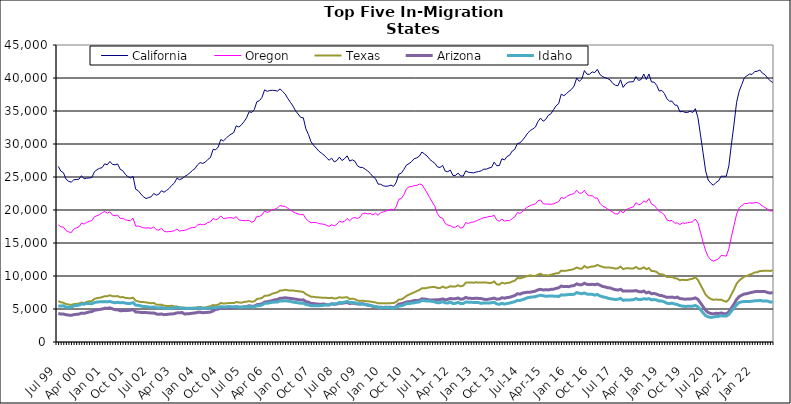
| Category | California | Oregon | Texas | Arizona | Idaho |
|---|---|---|---|---|---|
| Jul 99 | 26605 | 17749 | 6209 | 4339 | 5471 |
| Aug 99 | 25882 | 17447 | 6022 | 4228 | 5444 |
| Sep 99 | 25644 | 17401 | 5941 | 4237 | 5488 |
| Oct 99 | 24669 | 16875 | 5751 | 4134 | 5279 |
| Nov 99 | 24353 | 16701 | 5680 | 4073 | 5260 |
| Dec 99 | 24218 | 16570 | 5619 | 4042 | 5269 |
| Jan 00 | 24574 | 17109 | 5736 | 4142 | 5485 |
| Feb 00 | 24620 | 17295 | 5789 | 4192 | 5530 |
| Mar 00 | 24655 | 17436 | 5826 | 4226 | 5590 |
| Apr 00 | 25195 | 18009 | 5980 | 4375 | 5748 |
| May 00 | 24730 | 17875 | 5897 | 4337 | 5729 |
| Jun 00 | 24825 | 18113 | 6070 | 4444 | 5853 |
| Jul 00 | 24857 | 18294 | 6163 | 4555 | 5824 |
| Aug 00 | 24913 | 18376 | 6199 | 4603 | 5788 |
| Sep 00 | 25792 | 18971 | 6529 | 4804 | 5976 |
| Oct 00 | 26106 | 19135 | 6643 | 4870 | 6058 |
| Nov 00 | 26315 | 19306 | 6705 | 4926 | 6085 |
| Dec 00 | 26415 | 19570 | 6793 | 4991 | 6096 |
| Jan 01 | 26995 | 19781 | 6942 | 5122 | 6119 |
| Feb 01 | 26851 | 19519 | 6948 | 5089 | 6090 |
| Mar 01 | 27352 | 19720 | 7080 | 5180 | 6143 |
| Apr 01 | 26918 | 19221 | 6943 | 5020 | 6020 |
| May 01 | 26848 | 19126 | 6924 | 4899 | 5950 |
| Jun 01 | 26974 | 19241 | 6959 | 4895 | 6019 |
| Jul 01 | 26172 | 18725 | 6778 | 4737 | 5951 |
| Aug 01 | 25943 | 18736 | 6810 | 4757 | 5973 |
| Sep 01 | 25399 | 18514 | 6688 | 4753 | 5895 |
| Oct 01 | 25050 | 18415 | 6650 | 4780 | 5833 |
| Nov 01 | 24873 | 18381 | 6631 | 4826 | 5850 |
| Dec 01 | 25099 | 18765 | 6708 | 4898 | 5969 |
| Jan 02 | 23158 | 17561 | 6261 | 4560 | 5595 |
| Feb 02 | 22926 | 17573 | 6162 | 4531 | 5560 |
| Mar 02 | 22433 | 17452 | 6052 | 4481 | 5458 |
| Apr 02 | 22012 | 17314 | 6046 | 4458 | 5380 |
| May 02 | 21733 | 17267 | 6007 | 4452 | 5358 |
| Jun 02 | 21876 | 17298 | 5933 | 4444 | 5315 |
| Jul 02 | 21997 | 17209 | 5873 | 4383 | 5243 |
| Aug 02 | 22507 | 17436 | 5929 | 4407 | 5315 |
| Sep 02 | 22244 | 17010 | 5672 | 4248 | 5192 |
| Oct 02 | 22406 | 16952 | 5625 | 4191 | 5167 |
| Nov 02 | 22922 | 17223 | 5663 | 4242 | 5221 |
| Dec 02 | 22693 | 16770 | 5499 | 4142 | 5120 |
| Jan 03 | 22964 | 16694 | 5463 | 4166 | 5089 |
| Feb 03 | 23276 | 16727 | 5461 | 4226 | 5077 |
| Mar 03 | 23736 | 16766 | 5486 | 4251 | 5145 |
| Apr 03 | 24079 | 16859 | 5389 | 4289 | 5145 |
| May 03 | 24821 | 17117 | 5378 | 4415 | 5254 |
| Jun 03 | 24592 | 16812 | 5273 | 4426 | 5135 |
| Jul 03 | 24754 | 16875 | 5226 | 4466 | 5124 |
| Aug 03 | 25092 | 16922 | 5181 | 4244 | 5100 |
| Sep 03 | 25316 | 17036 | 5181 | 4279 | 5086 |
| Oct 03 | 25622 | 17228 | 5139 | 4301 | 5110 |
| Nov 03 | 25984 | 17335 | 5175 | 4362 | 5091 |
| Dec 03 | 26269 | 17350 | 5189 | 4396 | 5113 |
| Jan 04 | 26852 | 17734 | 5255 | 4492 | 5152 |
| Feb 04 | 27184 | 17860 | 5301 | 4502 | 5183 |
| Mar 04 | 27062 | 17757 | 5227 | 4443 | 5056 |
| Apr 04 | 27238 | 17840 | 5227 | 4461 | 5104 |
| May 04 | 27671 | 18113 | 5345 | 4493 | 5095 |
| Jun 04 | 27949 | 18201 | 5416 | 4532 | 5103 |
| Jul 04 | 29172 | 18727 | 5597 | 4697 | 5231 |
| Aug 04 | 29122 | 18529 | 5561 | 4945 | 5197 |
| Sep 04 | 29542 | 18678 | 5656 | 4976 | 5237 |
| Oct 04 | 30674 | 19108 | 5922 | 5188 | 5363 |
| Nov 04 | 30472 | 18716 | 5823 | 5106 | 5321 |
| Dec 04 | 30831 | 18755 | 5838 | 5135 | 5312 |
| Jan 05 | 31224 | 18823 | 5906 | 5155 | 5374 |
| Feb 05 | 31495 | 18842 | 5898 | 5168 | 5357 |
| Mar 05 | 31714 | 18738 | 5894 | 5212 | 5313 |
| Apr 05 | 32750 | 18998 | 6060 | 5340 | 5350 |
| May 05 | 32575 | 18504 | 5989 | 5269 | 5276 |
| Jun 05 | 32898 | 18414 | 5954 | 5252 | 5271 |
| Jul 05 | 33384 | 18395 | 6062 | 5322 | 5322 |
| Aug 05 | 33964 | 18381 | 6113 | 5375 | 5316 |
| Sep 05 | 34897 | 18426 | 6206 | 5493 | 5362 |
| Oct 05 | 34780 | 18132 | 6100 | 5408 | 5308 |
| Nov 05 | 35223 | 18332 | 6162 | 5434 | 5314 |
| Dec 05 | 36415 | 19047 | 6508 | 5658 | 5487 |
| Jan 06 | 36567 | 19032 | 6576 | 5688 | 5480 |
| Feb 06 | 37074 | 19257 | 6692 | 5792 | 5616 |
| Mar 06 | 38207 | 19845 | 6993 | 6052 | 5850 |
| Apr 06 | 37976 | 19637 | 7024 | 6101 | 5864 |
| May 06 | 38099 | 19781 | 7114 | 6178 | 5943 |
| Jun 06 | 38141 | 20061 | 7331 | 6276 | 6018 |
| Jul 06 | 38097 | 20111 | 7431 | 6399 | 6046 |
| Aug 06 | 38021 | 20333 | 7542 | 6450 | 6064 |
| Sep 06 | 38349 | 20686 | 7798 | 6627 | 6232 |
| Oct 06 | 37947 | 20591 | 7825 | 6647 | 6216 |
| Nov 06 | 37565 | 20526 | 7907 | 6707 | 6244 |
| Dec 06 | 36884 | 20272 | 7840 | 6648 | 6192 |
| Jan 07 | 36321 | 19984 | 7789 | 6597 | 6151 |
| Feb 07 | 35752 | 19752 | 7799 | 6554 | 6048 |
| Mar 07 | 35025 | 19547 | 7737 | 6487 | 5989 |
| Apr 07 | 34534 | 19412 | 7685 | 6430 | 5937 |
| May 07 | 34022 | 19296 | 7654 | 6353 | 5858 |
| Jun 07 | 33974 | 19318 | 7577 | 6390 | 5886 |
| Jul 07 | 32298 | 18677 | 7250 | 6117 | 5682 |
| Aug 07 | 31436 | 18322 | 7070 | 6034 | 5617 |
| Sep 07 | 30331 | 18087 | 6853 | 5847 | 5500 |
| Oct 07 | 29813 | 18108 | 6839 | 5821 | 5489 |
| Nov 07 | 29384 | 18105 | 6777 | 5769 | 5481 |
| Dec 07 | 28923 | 17949 | 6760 | 5733 | 5499 |
| Jan 08 | 28627 | 17890 | 6721 | 5732 | 5521 |
| Feb 08 | 28328 | 17834 | 6719 | 5749 | 5579 |
| Mar 08 | 27911 | 17680 | 6690 | 5650 | 5614 |
| Apr 08 | 27543 | 17512 | 6656 | 5612 | 5635 |
| May 08 | 27856 | 17754 | 6705 | 5774 | 5798 |
| Jun 08 | 27287 | 17589 | 6593 | 5717 | 5745 |
| Jul 08 | 27495 | 17834 | 6623 | 5761 | 5807 |
| Aug 08 | 28018 | 18309 | 6789 | 5867 | 5982 |
| Sep-08 | 27491 | 18164 | 6708 | 5864 | 5954 |
| Oct 08 | 27771 | 18291 | 6755 | 5942 | 6032 |
| Nov 08 | 28206 | 18706 | 6787 | 5970 | 6150 |
| Dec 08 | 27408 | 18353 | 6505 | 5832 | 5975 |
| Jan 09 | 27601 | 18778 | 6569 | 5890 | 5995 |
| Feb 09 | 27394 | 18863 | 6483 | 5845 | 5936 |
| Mar 09 | 26690 | 18694 | 6273 | 5751 | 5806 |
| Apr 09 | 26461 | 18943 | 6222 | 5735 | 5777 |
| May 09 | 26435 | 19470 | 6272 | 5819 | 5767 |
| Jun 09 | 26187 | 19522 | 6199 | 5700 | 5649 |
| Jul 09 | 25906 | 19408 | 6171 | 5603 | 5617 |
| Aug 09 | 25525 | 19469 | 6128 | 5533 | 5540 |
| Sep 09 | 25050 | 19249 | 6059 | 5405 | 5437 |
| Oct 09 | 24741 | 19529 | 6004 | 5349 | 5369 |
| Nov 09 | 23928 | 19187 | 5854 | 5271 | 5248 |
| Dec 09 | 23899 | 19607 | 5886 | 5261 | 5195 |
| Jan 10 | 23676 | 19703 | 5881 | 5232 | 5234 |
| Feb 10 | 23592 | 19845 | 5850 | 5272 | 5236 |
| Mar 10 | 23634 | 19946 | 5864 | 5278 | 5219 |
| Apr 10 | 23774 | 20134 | 5889 | 5257 | 5201 |
| May 10 | 23567 | 19966 | 5897 | 5172 | 5105 |
| Jun 10 | 24166 | 20464 | 6087 | 5356 | 5237 |
| Jul 10 | 25410 | 21627 | 6417 | 5742 | 5452 |
| Aug 10 | 25586 | 21744 | 6465 | 5797 | 5491 |
| Sep 10 | 26150 | 22314 | 6667 | 5907 | 5609 |
| Oct 10 | 26807 | 23219 | 6986 | 6070 | 5831 |
| Nov 10 | 27033 | 23520 | 7179 | 6100 | 5810 |
| Dec 10 | 27332 | 23551 | 7361 | 6182 | 5898 |
| Jan 11 | 27769 | 23697 | 7525 | 6276 | 5938 |
| Feb 11 | 27898 | 23718 | 7708 | 6267 | 6016 |
| Mar 11 | 28155 | 23921 | 7890 | 6330 | 6081 |
| Apr 11 | 28790 | 23847 | 8146 | 6544 | 6305 |
| May 11 | 28471 | 23215 | 8131 | 6502 | 6248 |
| Jun 11 | 28191 | 22580 | 8199 | 6445 | 6217 |
| Jul 11 | 27678 | 21867 | 8291 | 6368 | 6202 |
| Aug 11 | 27372 | 21203 | 8321 | 6356 | 6146 |
| Sep 11 | 27082 | 20570 | 8341 | 6387 | 6075 |
| Oct 11 | 26528 | 19442 | 8191 | 6402 | 5932 |
| Nov 11 | 26440 | 18872 | 8176 | 6426 | 5968 |
| Dec 11 | 26770 | 18784 | 8401 | 6533 | 6106 |
| Jan 12 | 25901 | 17963 | 8202 | 6390 | 5933 |
| Feb 12 | 25796 | 17718 | 8266 | 6456 | 5900 |
| Mar 12 | 26042 | 17647 | 8456 | 6600 | 6054 |
| Apr 12 | 25239 | 17386 | 8388 | 6534 | 5838 |
| May 12 | 25238 | 17407 | 8401 | 6558 | 5854 |
| Jun 12 | 25593 | 17673 | 8594 | 6669 | 6009 |
| Jul 12 | 25155 | 17237 | 8432 | 6474 | 5817 |
| Aug 12 | 25146 | 17391 | 8536 | 6539 | 5842 |
| Sep 12 | 25942 | 18102 | 8989 | 6759 | 6061 |
| Oct 12 | 25718 | 17953 | 9012 | 6618 | 6027 |
| Nov 12 | 25677 | 18134 | 9032 | 6611 | 6009 |
| Dec 12 | 25619 | 18166 | 8981 | 6601 | 5999 |
| Jan 13 | 25757 | 18344 | 9051 | 6627 | 5989 |
| Feb-13 | 25830 | 18512 | 9001 | 6606 | 5968 |
| Mar-13 | 25940 | 18689 | 9021 | 6577 | 5853 |
| Apr 13 | 26187 | 18844 | 9013 | 6478 | 5925 |
| May 13 | 26192 | 18884 | 9003 | 6431 | 5924 |
| Jun-13 | 26362 | 19013 | 8948 | 6508 | 5896 |
| Jul 13 | 26467 | 19037 | 8958 | 6559 | 5948 |
| Aug 13 | 27253 | 19198 | 9174 | 6655 | 6020 |
| Sep 13 | 26711 | 18501 | 8747 | 6489 | 5775 |
| Oct 13 | 26733 | 18301 | 8681 | 6511 | 5711 |
| Nov 13 | 27767 | 18620 | 8989 | 6709 | 5860 |
| Dec 13 | 27583 | 18320 | 8863 | 6637 | 5740 |
| Jan 14 | 28107 | 18409 | 8939 | 6735 | 5843 |
| Feb-14 | 28313 | 18383 | 8989 | 6779 | 5893 |
| Mar 14 | 28934 | 18696 | 9160 | 6918 | 6015 |
| Apr 14 | 29192 | 18946 | 9291 | 7036 | 6099 |
| May 14 | 30069 | 19603 | 9701 | 7314 | 6304 |
| Jun 14 | 30163 | 19487 | 9641 | 7252 | 6293 |
| Jul-14 | 30587 | 19754 | 9752 | 7415 | 6427 |
| Aug-14 | 31074 | 20201 | 9882 | 7499 | 6557 |
| Sep 14 | 31656 | 20459 | 9997 | 7536 | 6719 |
| Oct 14 | 32037 | 20663 | 10109 | 7555 | 6786 |
| Nov 14 | 32278 | 20825 | 9992 | 7628 | 6831 |
| Dec 14 | 32578 | 20918 | 10006 | 7705 | 6860 |
| Jan 15 | 33414 | 21396 | 10213 | 7906 | 7000 |
| Feb 15 | 33922 | 21518 | 10337 | 7982 | 7083 |
| Mar 15 | 33447 | 20942 | 10122 | 7891 | 7006 |
| Apr-15 | 33731 | 20893 | 10138 | 7906 | 6931 |
| May 15 | 34343 | 20902 | 10053 | 7895 | 6952 |
| Jun-15 | 34572 | 20870 | 10192 | 7973 | 6966 |
| Jul 15 | 35185 | 20916 | 10303 | 8000 | 6949 |
| Aug 15 | 35780 | 21115 | 10399 | 8126 | 6938 |
| Sep 15 | 36109 | 21246 | 10428 | 8207 | 6896 |
| Oct 15 | 37555 | 21908 | 10813 | 8477 | 7140 |
| Nov 15 | 37319 | 21750 | 10763 | 8390 | 7112 |
| Dec 15 | 37624 | 21990 | 10807 | 8395 | 7149 |
| Jan 16 | 37978 | 22248 | 10892 | 8388 | 7201 |
| Feb 16 | 38285 | 22369 | 10951 | 8508 | 7192 |
| Mar 16 | 38792 | 22506 | 11075 | 8547 | 7226 |
| Apr 16 | 39994 | 22999 | 11286 | 8815 | 7487 |
| May 16 | 39488 | 22548 | 11132 | 8673 | 7382 |
| Jun 16 | 39864 | 22556 | 11100 | 8682 | 7315 |
| Jul 16 | 41123 | 22989 | 11516 | 8903 | 7420 |
| Aug 16 | 40573 | 22333 | 11251 | 8731 | 7261 |
| Sep 16 | 40560 | 22162 | 11340 | 8692 | 7216 |
| Oct 16 | 40923 | 22172 | 11456 | 8742 | 7233 |
| Nov 16 | 40817 | 21818 | 11459 | 8685 | 7101 |
| Dec 16 | 41311 | 21815 | 11681 | 8783 | 7203 |
| Jan 17 | 40543 | 21029 | 11524 | 8609 | 6982 |
| Feb 17 | 40218 | 20613 | 11385 | 8416 | 6852 |
| Mar 17 | 40052 | 20425 | 11276 | 8354 | 6775 |
| Apr 17 | 39913 | 20147 | 11297 | 8218 | 6653 |
| May 17 | 39695 | 19910 | 11265 | 8196 | 6552 |
| Jun 17 | 39177 | 19650 | 11225 | 8034 | 6500 |
| Jul 17 | 38901 | 19419 | 11115 | 7923 | 6429 |
| Aug 17 | 38827 | 19389 | 11168 | 7867 | 6479 |
| Sep 17 | 39736 | 19936 | 11426 | 7991 | 6609 |
| Oct 17 | 38576 | 19547 | 11041 | 7708 | 6315 |
| Nov 17 | 39108 | 20013 | 11158 | 7746 | 6381 |
| Dec 17 | 39359 | 20202 | 11185 | 7743 | 6366 |
| Jan 18 | 39420 | 20362 | 11118 | 7736 | 6380 |
| Feb 18 | 39440 | 20476 | 11128 | 7741 | 6407 |
| Mar 18 | 40218 | 21106 | 11362 | 7789 | 6578 |
| Apr 18 | 39637 | 20788 | 11111 | 7642 | 6423 |
| May 18 | 39777 | 20933 | 11097 | 7591 | 6430 |
| Jun 18 | 40602 | 21381 | 11317 | 7721 | 6554 |
| Jul 18 | 39767 | 21189 | 11038 | 7445 | 6489 |
| Aug 18 | 40608 | 21729 | 11200 | 7560 | 6569 |
| Sep 18 | 39395 | 20916 | 10772 | 7318 | 6383 |
| Oct 18 | 39383 | 20724 | 10740 | 7344 | 6429 |
| Nov 18 | 38891 | 20265 | 10605 | 7255 | 6365 |
| Dec 18 | 38013 | 19741 | 10292 | 7069 | 6205 |
| Jan 19 | 38130 | 19643 | 10261 | 7032 | 6203 |
| Feb 19 | 37658 | 19237 | 10132 | 6892 | 6073 |
| Mar 19 | 36831 | 18492 | 9848 | 6766 | 5863 |
| Apr 19 | 36492 | 18349 | 9839 | 6763 | 5827 |
| May 19 | 36481 | 18407 | 9867 | 6809 | 5873 |
| Jun 19 | 35925 | 17998 | 9661 | 6698 | 5761 |
| Jul 19 | 35843 | 18049 | 9598 | 6800 | 5673 |
| Aug 19 | 34870 | 17785 | 9361 | 6577 | 5512 |
| Sep 19 | 34945 | 18038 | 9428 | 6547 | 5437 |
| Oct 19 | 34802 | 17977 | 9385 | 6483 | 5390 |
| Nov 19 | 34775 | 18072 | 9403 | 6511 | 5401 |
| Dec 19 | 34976 | 18140 | 9518 | 6521 | 5419 |
| Jan 20 | 34774 | 18209 | 9594 | 6561 | 5434 |
| Feb 20 | 35352 | 18632 | 9804 | 6682 | 5543 |
| Mar 20 | 34013 | 18041 | 9411 | 6464 | 5330 |
| Apr 20 | 31385 | 16629 | 8666 | 5922 | 4906 |
| May 20 | 28657 | 15123 | 7927 | 5355 | 4419 |
| Jun 20 | 25915 | 13817 | 7164 | 4815 | 3992 |
| Jul 20 | 24545 | 12926 | 6776 | 4457 | 3810 |
| Aug 20 | 24048 | 12443 | 6521 | 4326 | 3720 |
| Sep 20 | 23756 | 12258 | 6386 | 4266 | 3784 |
| Oct 20 | 24166 | 12429 | 6452 | 4347 | 3861 |
| Nov 20 | 24404 | 12597 | 6386 | 4324 | 3883 |
| Dec 20 | 25120 | 13122 | 6420 | 4394 | 3974 |
| Jan 21 | 25111 | 13080 | 6236 | 4304 | 3924 |
| Feb 21 | 25114 | 13015 | 6094 | 4260 | 3930 |
| Mar 21 | 26701 | 14096 | 6455 | 4567 | 4185 |
| Apr 21 | 29998 | 15978 | 7222 | 5164 | 4697 |
| May 21 | 33020 | 17641 | 7969 | 5748 | 5148 |
| Jun 21 | 36320 | 19369 | 8840 | 6450 | 5628 |
| Jul 21 | 37989 | 20320 | 9306 | 6877 | 5984 |
| Aug 21 | 39007 | 20657 | 9615 | 7094 | 6084 |
| Sep 21 | 40023 | 20974 | 9914 | 7277 | 6151 |
| Oct 21 | 40348 | 20966 | 10003 | 7327 | 6140 |
| Nov 21 | 40599 | 21096 | 10203 | 7437 | 6136 |
| Dec 21 | 40548 | 21032 | 10328 | 7532 | 6183 |
| Jan 22 | 40967 | 21106 | 10535 | 7618 | 6237 |
| Feb 22 | 41019 | 21125 | 10579 | 7673 | 6236 |
| Mar 22 | 41220 | 20949 | 10751 | 7660 | 6310 |
| Apr 22 | 40730 | 20602 | 10772 | 7661 | 6221 |
| May 22 | 40504 | 20370 | 10792 | 7636 | 6210 |
| Jun 22 | 40013 | 20127 | 10802 | 7504 | 6199 |
| Jul 22 | 39582 | 19846 | 10761 | 7419 | 6050 |
| Aug 22 | 39321 | 19865 | 10868 | 7487 | 6071 |